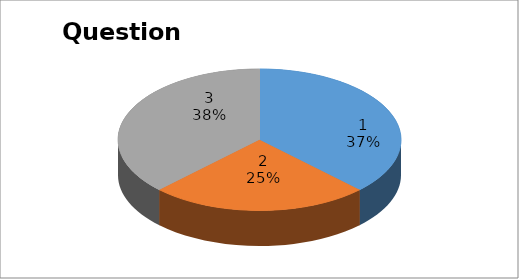
| Category | Series 0 |
|---|---|
| 0 | 3 |
| 1 | 2 |
| 2 | 3 |